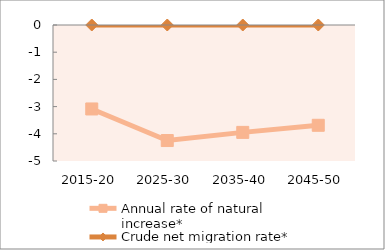
| Category | Annual rate of natural increase* | Crude net migration rate* |
|---|---|---|
| 2015-20 | -3.087 | 0 |
| 2025-30 | -4.248 | 0 |
| 2035-40 | -3.948 | 0 |
| 2045-50 | -3.687 | 0 |